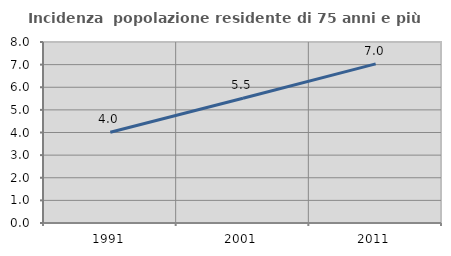
| Category | Incidenza  popolazione residente di 75 anni e più |
|---|---|
| 1991.0 | 4.012 |
| 2001.0 | 5.514 |
| 2011.0 | 7.035 |